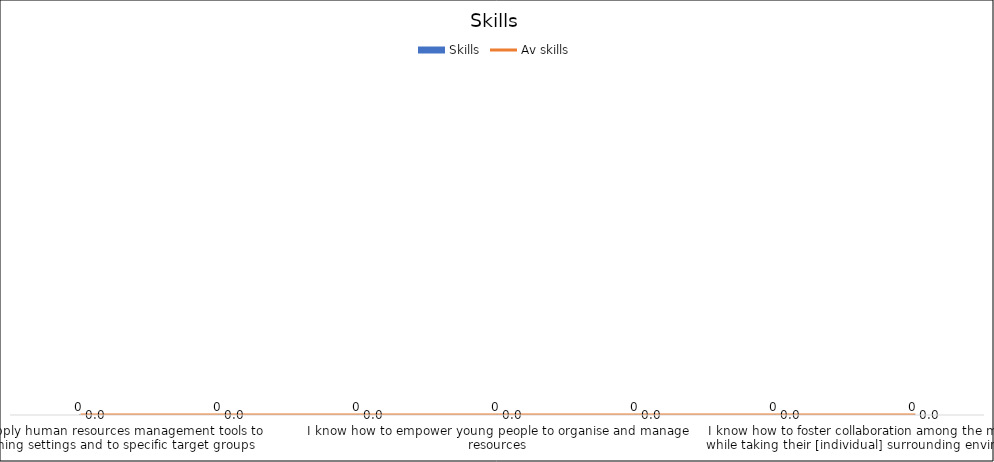
| Category | Skills |
|---|---|
| I know how to apply human resources management tools to non-formal learning settings and to specific target groups | 0 |
| I know how to use an inspirational leadership approach  | 0 |
| I know how to adjust programme elements to resources management | 0 |
| I know how to empower young people to organise and manage resources | 0 |
| I know how to manage/deal with frustrations, conflicts and risks | 0 |
| I am able to work with diverse groups in a non-formal learning context | 0 |
| I know how to foster collaboration among the members of the group while taking their [individual] surrounding environment into account  | 0 |